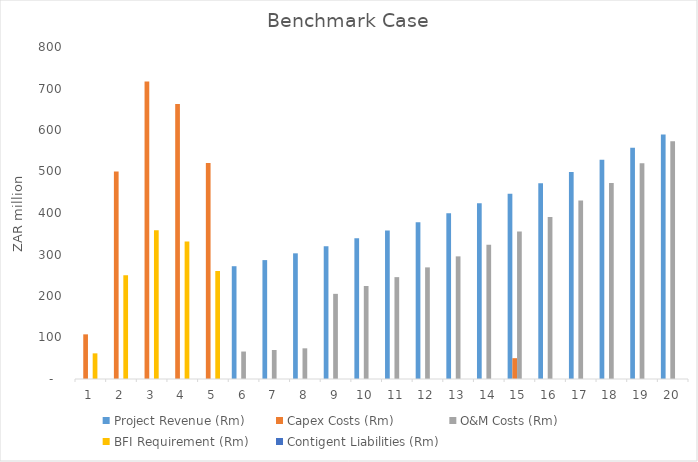
| Category | Project Revenue (Rm) | Capex Costs (Rm) | O&M Costs (Rm) | BFI Requirement (Rm) | Contigent Liabilities (Rm) |
|---|---|---|---|---|---|
| 0 | 0 | 107.6 | 0 | 61.808 | 0 |
| 1 | 0 | 500 | 0 | 250 | 0 |
| 2 | 0 | 716.621 | 0 | 358.31 | 0 |
| 3 | 0 | 662.826 | 0 | 331.413 | 0 |
| 4 | 0 | 520.553 | 0 | 260.277 | 0 |
| 5 | 271.788 | 0 | 66.17 | 0 | 0 |
| 6 | 286.495 | 0 | 69.942 | 0 | 0 |
| 7 | 302.825 | 0 | 73.929 | 0 | 0 |
| 8 | 320.086 | 0 | 205.186 | 0 | 0 |
| 9 | 339.258 | 0 | 224.148 | 0 | 0 |
| 10 | 357.616 | 0 | 245.453 | 0 | 0 |
| 11 | 378 | 0 | 268.972 | 0 | 0 |
| 12 | 399.546 | 0 | 295.489 | 0 | 0 |
| 13 | 423.477 | 0 | 323.654 | 0 | 0 |
| 14 | 446.392 | 50.152 | 355.39 | 0 | 0 |
| 15 | 471.837 | 0 | 390.494 | 0 | 0 |
| 16 | 498.731 | 0 | 430.181 | 0 | 0 |
| 17 | 528.603 | 0 | 472.343 | 0 | 0 |
| 18 | 557.207 | 0 | 519.971 | 0 | 0 |
| 19 | 588.968 | 0 | 572.741 | 0 | 0 |